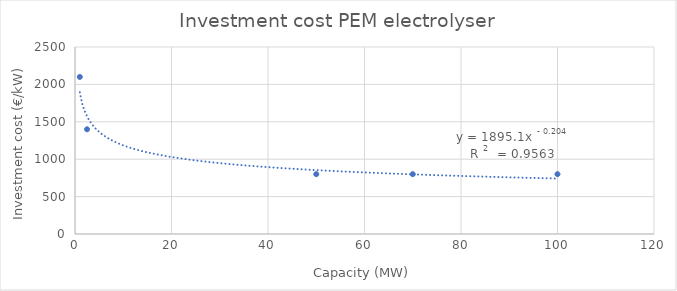
| Category | Series 0 |
|---|---|
| 1.0 | 2100 |
| 2.5 | 1400 |
| 50.0 | 800 |
| 70.0 | 800 |
| 100.0 | 800 |